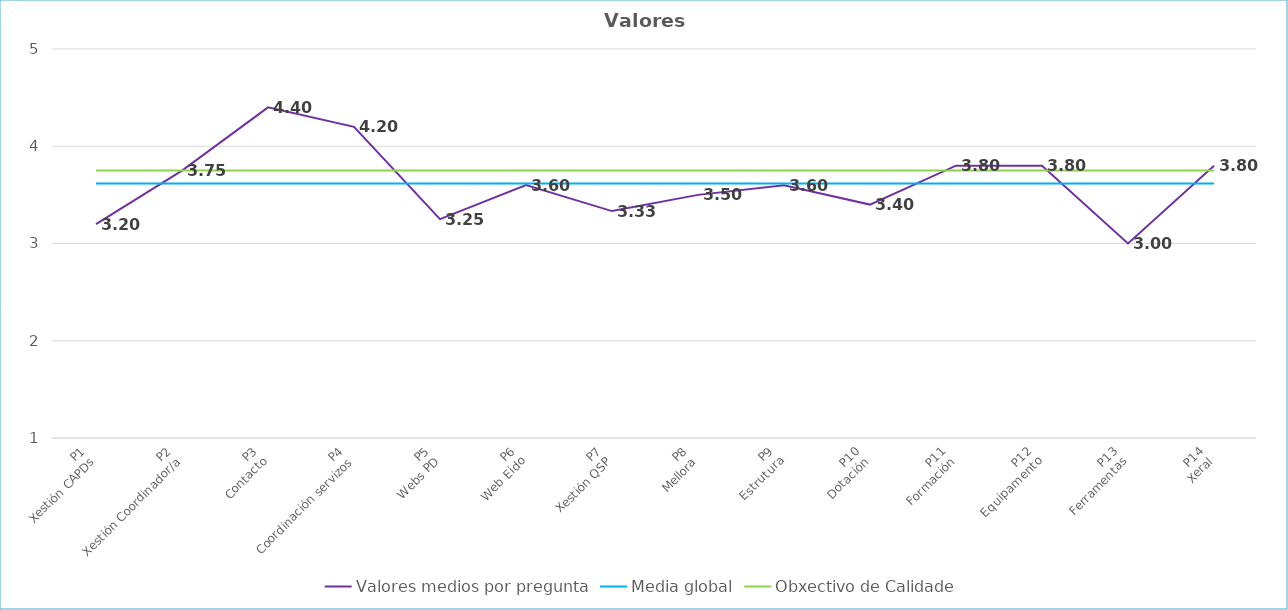
| Category | Valores medios por pregunta | Media global | Obxectivo de Calidade |
|---|---|---|---|
| P1
Xestión CAPDs | 3.2 | 3.617 | 3.75 |
| P2
Xestión Coordinador/a | 3.75 | 3.617 | 3.75 |
| P3
Contacto | 4.4 | 3.617 | 3.75 |
| P4
Coordinación servizos | 4.2 | 3.617 | 3.75 |
| P5
Webs PD | 3.25 | 3.617 | 3.75 |
| P6
Web Eido | 3.6 | 3.617 | 3.75 |
| P7
Xestión QSP | 3.333 | 3.617 | 3.75 |
| P8
Mellora | 3.5 | 3.617 | 3.75 |
| P9
Estrutura | 3.6 | 3.617 | 3.75 |
| P10
Dotación | 3.4 | 3.617 | 3.75 |
| P11
Formación | 3.8 | 3.617 | 3.75 |
| P12
Equipamento | 3.8 | 3.617 | 3.75 |
| P13
Ferramentas | 3 | 3.617 | 3.75 |
| P14
Xeral | 3.8 | 3.617 | 3.75 |